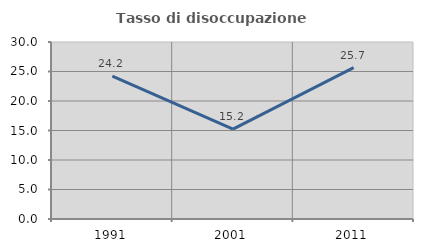
| Category | Tasso di disoccupazione giovanile  |
|---|---|
| 1991.0 | 24.196 |
| 2001.0 | 15.232 |
| 2011.0 | 25.651 |